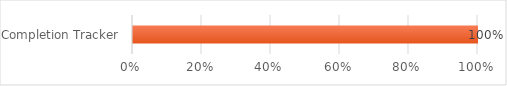
| Category | Series 0 |
|---|---|
| Completion Tracker | 1 |